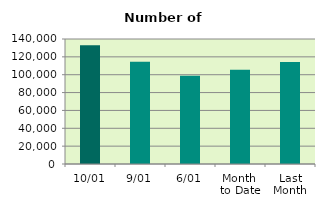
| Category | Series 0 |
|---|---|
| 10/01 | 132988 |
| 9/01 | 114654 |
| 6/01 | 98806 |
| Month 
to Date | 105573.429 |
| Last
Month | 114251.429 |